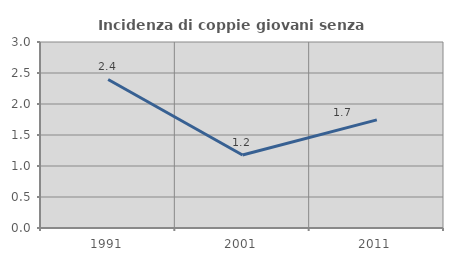
| Category | Incidenza di coppie giovani senza figli |
|---|---|
| 1991.0 | 2.395 |
| 2001.0 | 1.176 |
| 2011.0 | 1.744 |